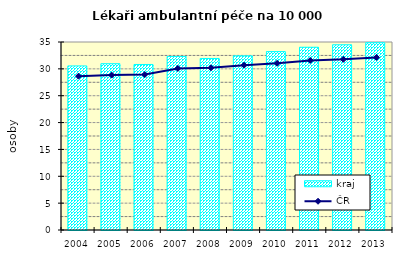
| Category | kraj |
|---|---|
| 2004.0 | 30.545 |
| 2005.0 | 30.958 |
| 2006.0 | 30.815 |
| 2007.0 | 32.307 |
| 2008.0 | 31.932 |
| 2009.0 | 32.419 |
| 2010.0 | 33.212 |
| 2011.0 | 34.022 |
| 2012.0 | 34.481 |
| 2013.0 | 34.87 |